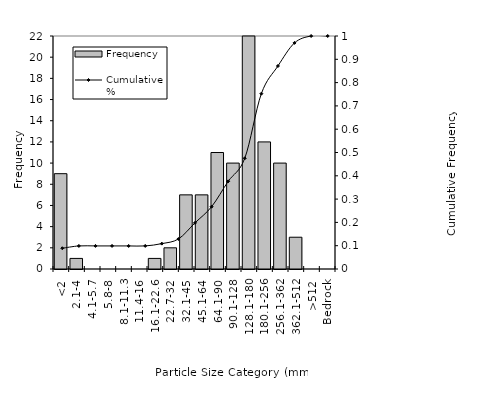
| Category | Frequency |
|---|---|
| <2 | 9 |
| 2.1-4 | 1 |
| 4.1-5.7 | 0 |
| 5.8-8 | 0 |
| 8.1-11.3 | 0 |
| 11.4-16 | 0 |
| 16.1-22.6 | 1 |
| 22.7-32 | 2 |
| 32.1-45 | 7 |
| 45.1-64 | 7 |
| 64.1-90 | 11 |
| 90.1-128 | 10 |
| 128.1-180 | 28 |
| 180.1-256 | 12 |
| 256.1-362 | 10 |
| 362.1-512 | 3 |
| >512 | 0 |
| Bedrock | 0 |